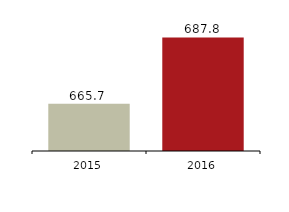
| Category | Loans to customers |
|---|---|
| 2016.0 | 687840 |
| 2015.0 | 665711 |